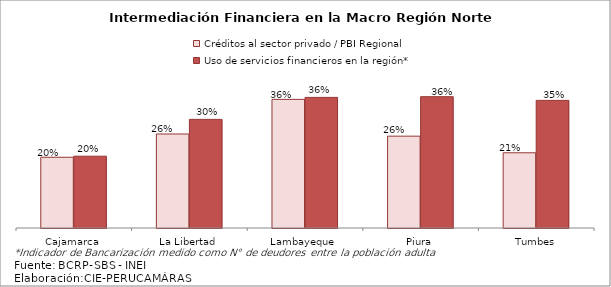
| Category | Créditos al sector privado / PBI Regional | Uso de servicios financieros en la región* |
|---|---|---|
| Cajamarca | 0.197 | 0.199 |
| La Libertad | 0.261 | 0.302 |
| Lambayeque | 0.357 | 0.363 |
| Piura | 0.255 | 0.365 |
| Tumbes | 0.209 | 0.355 |